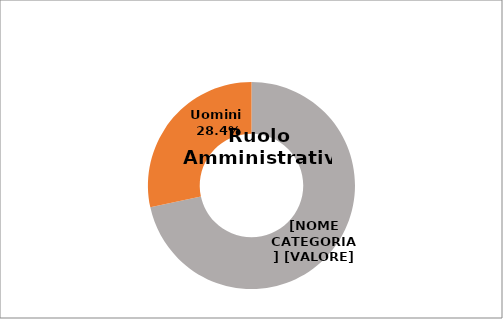
| Category | Series 0 |
|---|---|
| Donne  | 0.716 |
| Uomini  | 0.284 |